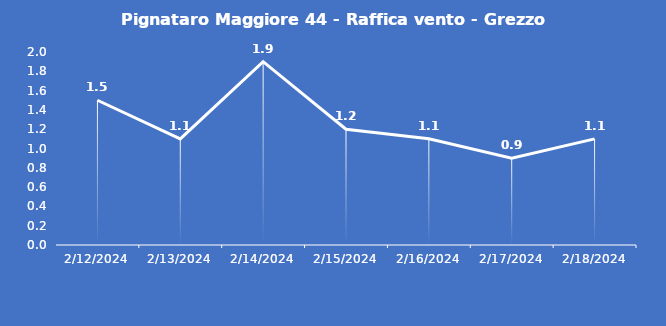
| Category | Pignataro Maggiore 44 - Raffica vento - Grezzo (m/s) |
|---|---|
| 2/12/24 | 1.5 |
| 2/13/24 | 1.1 |
| 2/14/24 | 1.9 |
| 2/15/24 | 1.2 |
| 2/16/24 | 1.1 |
| 2/17/24 | 0.9 |
| 2/18/24 | 1.1 |